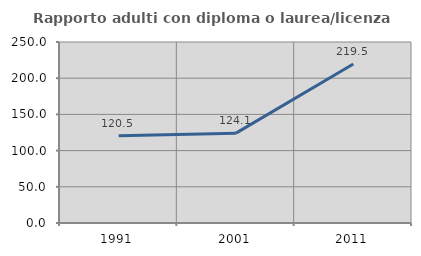
| Category | Rapporto adulti con diploma o laurea/licenza media  |
|---|---|
| 1991.0 | 120.53 |
| 2001.0 | 124.121 |
| 2011.0 | 219.512 |